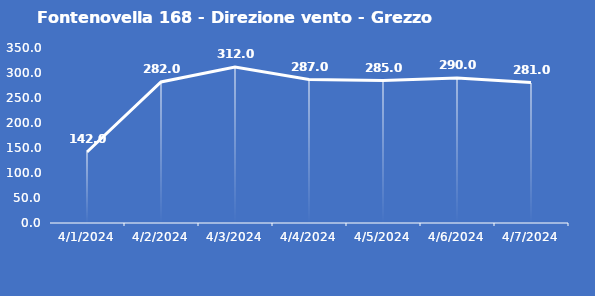
| Category | Fontenovella 168 - Direzione vento - Grezzo (°N) |
|---|---|
| 4/1/24 | 142 |
| 4/2/24 | 282 |
| 4/3/24 | 312 |
| 4/4/24 | 287 |
| 4/5/24 | 285 |
| 4/6/24 | 290 |
| 4/7/24 | 281 |